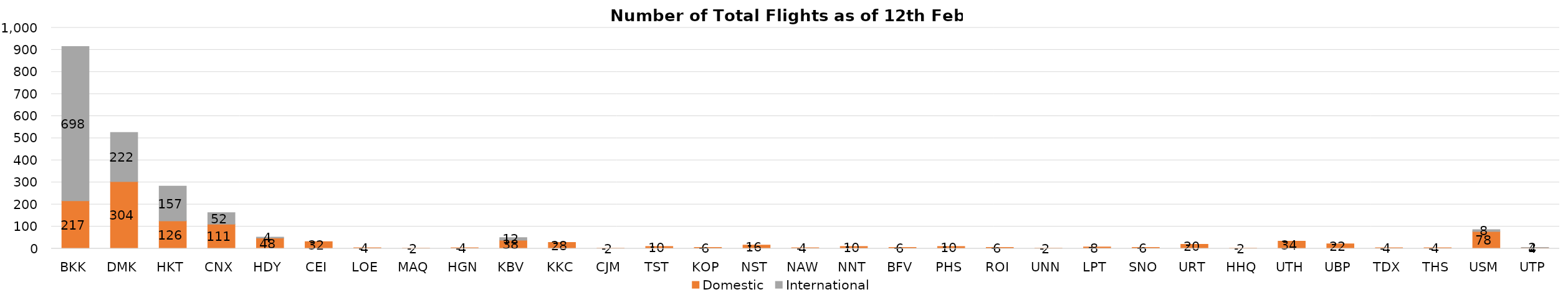
| Category | Domestic | International |
|---|---|---|
| BKK | 217 | 698 |
| DMK | 304 | 222 |
| HKT | 126 | 157 |
| CNX | 111 | 52 |
| HDY | 48 | 4 |
| CEI | 32 | 0 |
| LOE | 4 | 0 |
| MAQ | 2 | 0 |
| HGN | 4 | 0 |
| KBV | 38 | 12 |
| KKC | 28 | 0 |
| CJM | 2 | 0 |
| TST | 10 | 0 |
| KOP | 6 | 0 |
| NST | 16 | 0 |
| NAW | 4 | 0 |
| NNT | 10 | 0 |
| BFV | 6 | 0 |
| PHS | 10 | 0 |
| ROI | 6 | 0 |
| UNN | 2 | 0 |
| LPT | 8 | 0 |
| SNO | 6 | 0 |
| URT | 20 | 0 |
| HHQ | 2 | 0 |
| UTH | 34 | 0 |
| UBP | 22 | 0 |
| TDX | 4 | 0 |
| THS | 4 | 0 |
| USM | 78 | 8 |
| UTP | 4 | 2 |